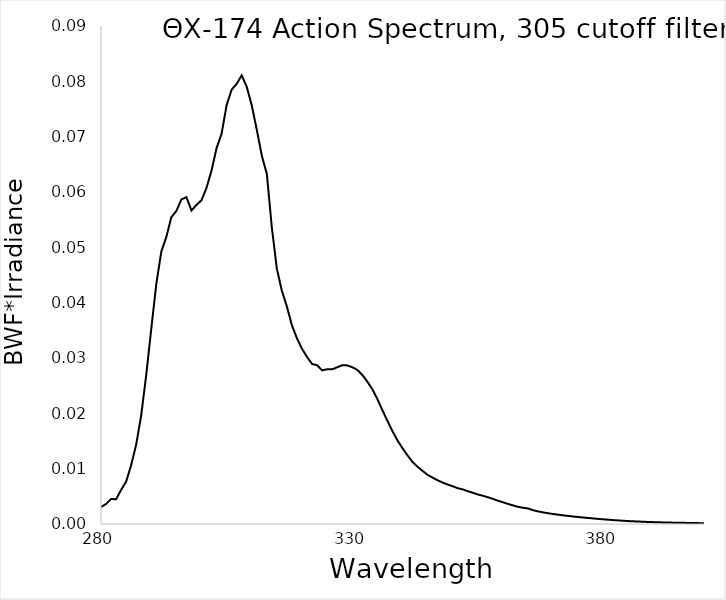
| Category | BWF |
|---|---|
| 280.0 | 0.003 |
| 281.0 | 0.004 |
| 282.0 | 0.005 |
| 283.0 | 0.004 |
| 284.0 | 0.006 |
| 285.0 | 0.008 |
| 286.0 | 0.011 |
| 287.0 | 0.014 |
| 288.0 | 0.02 |
| 289.0 | 0.027 |
| 290.0 | 0.035 |
| 291.0 | 0.043 |
| 292.0 | 0.049 |
| 293.0 | 0.052 |
| 294.0 | 0.055 |
| 295.0 | 0.057 |
| 296.0 | 0.059 |
| 297.0 | 0.059 |
| 298.0 | 0.057 |
| 299.0 | 0.058 |
| 300.0 | 0.059 |
| 301.0 | 0.061 |
| 302.0 | 0.064 |
| 303.0 | 0.068 |
| 304.0 | 0.071 |
| 305.0 | 0.076 |
| 306.0 | 0.078 |
| 307.0 | 0.08 |
| 308.0 | 0.081 |
| 309.0 | 0.079 |
| 310.0 | 0.076 |
| 311.0 | 0.071 |
| 312.0 | 0.067 |
| 313.0 | 0.063 |
| 314.0 | 0.054 |
| 315.0 | 0.046 |
| 316.0 | 0.042 |
| 317.0 | 0.039 |
| 318.0 | 0.036 |
| 319.0 | 0.034 |
| 320.0 | 0.032 |
| 321.0 | 0.03 |
| 322.0 | 0.029 |
| 323.0 | 0.029 |
| 324.0 | 0.028 |
| 325.0 | 0.028 |
| 326.0 | 0.028 |
| 327.0 | 0.028 |
| 328.0 | 0.029 |
| 329.0 | 0.029 |
| 330.0 | 0.028 |
| 331.0 | 0.028 |
| 332.0 | 0.027 |
| 333.0 | 0.026 |
| 334.0 | 0.024 |
| 335.0 | 0.023 |
| 336.0 | 0.021 |
| 337.0 | 0.019 |
| 338.0 | 0.017 |
| 339.0 | 0.015 |
| 340.0 | 0.014 |
| 341.0 | 0.012 |
| 342.0 | 0.011 |
| 343.0 | 0.01 |
| 344.0 | 0.01 |
| 345.0 | 0.009 |
| 346.0 | 0.008 |
| 347.0 | 0.008 |
| 348.0 | 0.007 |
| 349.0 | 0.007 |
| 350.0 | 0.007 |
| 351.0 | 0.006 |
| 352.0 | 0.006 |
| 353.0 | 0.006 |
| 354.0 | 0.006 |
| 355.0 | 0.005 |
| 356.0 | 0.005 |
| 357.0 | 0.005 |
| 358.0 | 0.005 |
| 359.0 | 0.004 |
| 360.0 | 0.004 |
| 361.0 | 0.004 |
| 362.0 | 0.003 |
| 363.0 | 0.003 |
| 364.0 | 0.003 |
| 365.0 | 0.003 |
| 366.0 | 0.002 |
| 367.0 | 0.002 |
| 368.0 | 0.002 |
| 369.0 | 0.002 |
| 370.0 | 0.002 |
| 371.0 | 0.002 |
| 372.0 | 0.002 |
| 373.0 | 0.001 |
| 374.0 | 0.001 |
| 375.0 | 0.001 |
| 376.0 | 0.001 |
| 377.0 | 0.001 |
| 378.0 | 0.001 |
| 379.0 | 0.001 |
| 380.0 | 0.001 |
| 381.0 | 0.001 |
| 382.0 | 0.001 |
| 383.0 | 0.001 |
| 384.0 | 0.001 |
| 385.0 | 0.001 |
| 386.0 | 0 |
| 387.0 | 0 |
| 388.0 | 0 |
| 389.0 | 0 |
| 390.0 | 0 |
| 391.0 | 0 |
| 392.0 | 0 |
| 393.0 | 0 |
| 394.0 | 0 |
| 395.0 | 0 |
| 396.0 | 0 |
| 397.0 | 0 |
| 398.0 | 0 |
| 399.0 | 0 |
| 400.0 | 0 |
| 401.0 | 0 |
| 402.0 | 0 |
| 403.0 | 0 |
| 404.0 | 0 |
| 405.0 | 0 |
| 406.0 | 0 |
| 407.0 | 0 |
| 408.0 | 0 |
| 409.0 | 0 |
| 410.0 | 0 |
| 411.0 | 0 |
| 412.0 | 0 |
| 413.0 | 0 |
| 414.0 | 0 |
| 415.0 | 0 |
| 416.0 | 0 |
| 417.0 | 0 |
| 418.0 | 0 |
| 419.0 | 0 |
| 420.0 | 0 |
| 421.0 | 0 |
| 422.0 | 0 |
| 423.0 | 0 |
| 424.0 | 0 |
| 425.0 | 0 |
| 426.0 | 0 |
| 427.0 | 0 |
| 428.0 | 0 |
| 429.0 | 0 |
| 430.0 | 0 |
| 431.0 | 0 |
| 432.0 | 0 |
| 433.0 | 0 |
| 434.0 | 0 |
| 435.0 | 0 |
| 436.0 | 0 |
| 437.0 | 0 |
| 438.0 | 0 |
| 439.0 | 0 |
| 440.0 | 0 |
| 441.0 | 0 |
| 442.0 | 0 |
| 443.0 | 0 |
| 444.0 | 0 |
| 445.0 | 0 |
| 446.0 | 0 |
| 447.0 | 0 |
| 448.0 | 0 |
| 449.0 | 0 |
| 450.0 | 0 |
| 451.0 | 0 |
| 452.0 | 0 |
| 453.0 | 0 |
| 454.0 | 0 |
| 455.0 | 0 |
| 456.0 | 0 |
| 457.0 | 0 |
| 458.0 | 0 |
| 459.0 | 0 |
| 460.0 | 0 |
| 461.0 | 0 |
| 462.0 | 0 |
| 463.0 | 0 |
| 464.0 | 0 |
| 465.0 | 0 |
| 466.0 | 0 |
| 467.0 | 0 |
| 468.0 | 0 |
| 469.0 | 0 |
| 470.0 | 0 |
| 471.0 | 0 |
| 472.0 | 0 |
| 473.0 | 0 |
| 474.0 | 0 |
| 475.0 | 0 |
| 476.0 | 0 |
| 477.0 | 0 |